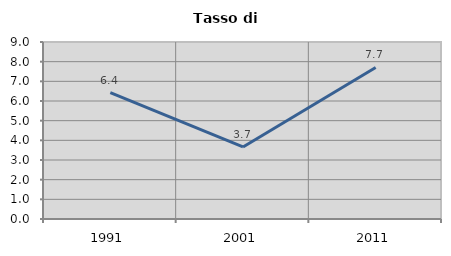
| Category | Tasso di disoccupazione   |
|---|---|
| 1991.0 | 6.426 |
| 2001.0 | 3.662 |
| 2011.0 | 7.706 |